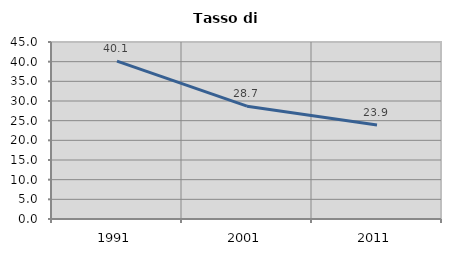
| Category | Tasso di disoccupazione   |
|---|---|
| 1991.0 | 40.142 |
| 2001.0 | 28.685 |
| 2011.0 | 23.907 |